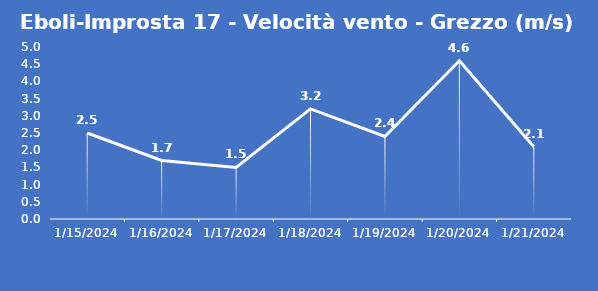
| Category | Eboli-Improsta 17 - Velocità vento - Grezzo (m/s) |
|---|---|
| 1/15/24 | 2.5 |
| 1/16/24 | 1.7 |
| 1/17/24 | 1.5 |
| 1/18/24 | 3.2 |
| 1/19/24 | 2.4 |
| 1/20/24 | 4.6 |
| 1/21/24 | 2.1 |